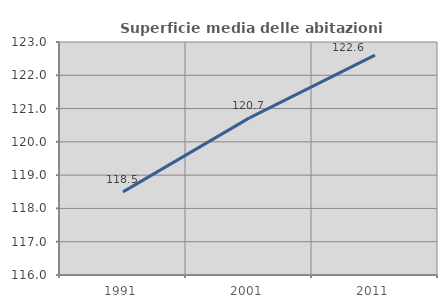
| Category | Superficie media delle abitazioni occupate |
|---|---|
| 1991.0 | 118.497 |
| 2001.0 | 120.714 |
| 2011.0 | 122.607 |